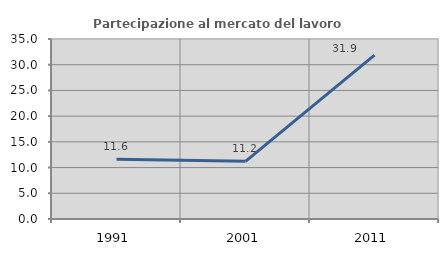
| Category | Partecipazione al mercato del lavoro  femminile |
|---|---|
| 1991.0 | 11.594 |
| 2001.0 | 11.207 |
| 2011.0 | 31.868 |